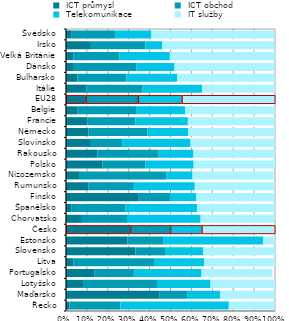
| Category |  ICT průmysl |  ICT obchod |  Telekomunikace |  IT služby |
|---|---|---|---|---|
| Řecko | 0.016 | 0.243 | 0.519 | 0.221 |
| Maďarsko | 0.445 | 0.134 | 0.159 | 0.262 |
| Lotyšsko | 0.085 | 0.35 | 0.256 | 0.308 |
| Portugalsko | 0.137 | 0.188 | 0.324 | 0.339 |
| Litva | 0.035 | 0.39 | 0.236 | 0.339 |
| Slovensko | 0.332 | 0.145 | 0.18 | 0.343 |
| Estonsko | 0.293 | 0.171 | 0.48 | 0.349 |
| Česko | 0.308 | 0.191 | 0.15 | 0.35 |
| Chorvatsko | 0.076 | 0.216 | 0.352 | 0.356 |
| Španělsko | 0.027 | 0.258 | 0.344 | 0.372 |
| Finsko | 0.345 | 0.153 | 0.126 | 0.376 |
| Rumunsko | 0.108 | 0.216 | 0.292 | 0.384 |
| Nizozemsko | 0.062 | 0.417 | 0.126 | 0.387 |
| Polsko | 0.175 | 0.206 | 0.23 | 0.389 |
| Rakousko | 0.15 | 0.294 | 0.166 | 0.39 |
| Slovinsko | 0.115 | 0.153 | 0.328 | 0.404 |
| Německo | 0.108 | 0.282 | 0.194 | 0.415 |
| Francie | 0.102 | 0.23 | 0.251 | 0.417 |
| Belgie | 0.053 | 0.285 | 0.232 | 0.43 |
| EU28 | 0.094 | 0.251 | 0.209 | 0.446 |
| Itálie | 0.097 | 0.269 | 0.285 | 0.446 |
| Bulharsko | 0.054 | 0.235 | 0.243 | 0.467 |
| Dánsko | 0.038 | 0.299 | 0.183 | 0.481 |
| Velká Británie | 0.035 | 0.22 | 0.242 | 0.503 |
| Irsko | 0.119 | 0.261 | 0.08 | 0.539 |
| Švédsko | 0.028 | 0.207 | 0.174 | 0.591 |